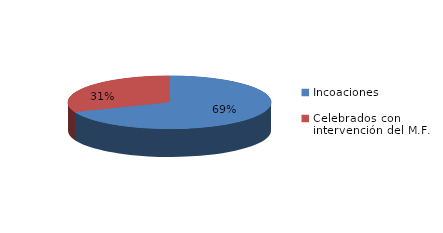
| Category | Series 0 |
|---|---|
| Incoaciones | 3175 |
| Celebrados con intervención del M.F. | 1424 |